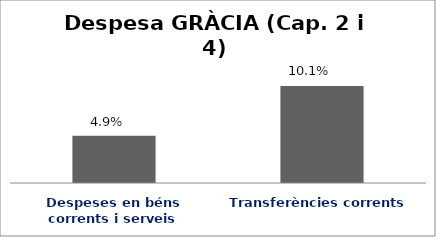
| Category | Series 0 |
|---|---|
| Despeses en béns corrents i serveis | 0.049 |
| Transferències corrents | 0.101 |